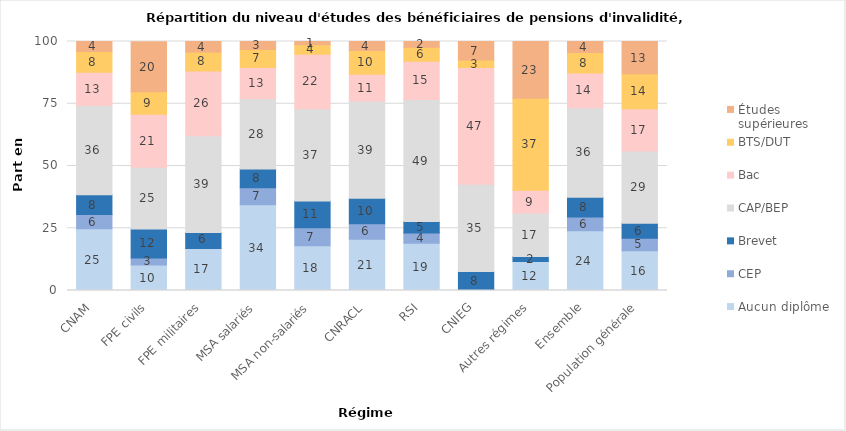
| Category | Aucun diplôme | CEP | Brevet | CAP/BEP | Bac | BTS/DUT | Études 
supérieures |
|---|---|---|---|---|---|---|---|
| 0 | 24.8 | 5.7 | 8 | 35.8 | 13.4 | 8.3 | 4.1 |
| 1 | 10.2 | 2.9 | 11.6 | 24.8 | 21.3 | 9 | 20.1 |
| 2 | 16.9 | 0 | 6.4 | 38.8 | 26.1 | 7.6 | 4.2 |
| 3 | 34.4 | 6.9 | 7.5 | 28.3 | 12.5 | 7.2 | 3.2 |
| 4 | 18 | 7.2 | 10.7 | 37.1 | 21.9 | 3.8 | 1.3 |
| 5 | 20.6 | 6.2 | 10.2 | 39.1 | 10.7 | 9.6 | 3.7 |
| 6 | 19 | 4.1 | 4.6 | 49 | 15.4 | 5.6 | 2.4 |
| 7 | 0 | 0 | 7.6 | 35.1 | 46.9 | 3 | 7.4 |
| 8 | 11.6 | 0 | 2.1 | 17.4 | 9.2 | 36.9 | 22.8 |
| 9 | 24 | 5.5 | 8 | 35.9 | 13.9 | 8.3 | 4.4 |
| 10 | 16 | 5 | 6 | 29 | 17 | 14 | 13 |